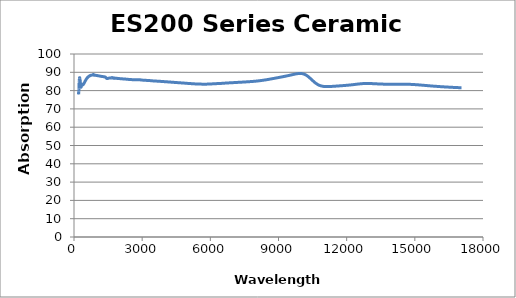
| Category | Absorption (%) |
|---|---|
| 200.0 | 78.962 |
| 202.0 | 78.067 |
| 204.0 | 78.136 |
| 206.0 | 78.055 |
| 208.0 | 78.484 |
| 210.0 | 78.688 |
| 212.0 | 79.382 |
| 214.0 | 79.749 |
| 216.0 | 80.206 |
| 218.0 | 80.399 |
| 220.0 | 80.989 |
| 222.0 | 82.009 |
| 224.0 | 83.18 |
| 226.0 | 84.331 |
| 228.0 | 84.98 |
| 230.0 | 85.338 |
| 232.0 | 85.501 |
| 234.0 | 85.71 |
| 236.0 | 85.977 |
| 238.0 | 86.397 |
| 240.0 | 86.532 |
| 242.0 | 86.776 |
| 244.0 | 86.933 |
| 246.0 | 87.055 |
| 248.0 | 87.084 |
| 250.0 | 87.006 |
| 252.0 | 87.03 |
| 254.0 | 86.836 |
| 256.0 | 86.605 |
| 258.0 | 86.37 |
| 260.0 | 86.319 |
| 262.0 | 86.257 |
| 264.0 | 86.175 |
| 266.0 | 86.02 |
| 268.0 | 85.838 |
| 270.0 | 85.639 |
| 272.0 | 85.391 |
| 274.0 | 85.179 |
| 276.0 | 84.985 |
| 278.0 | 84.712 |
| 280.0 | 84.433 |
| 282.0 | 84.157 |
| 284.0 | 83.98 |
| 286.0 | 83.795 |
| 288.0 | 83.529 |
| 290.0 | 83.291 |
| 292.0 | 83.122 |
| 294.0 | 82.952 |
| 296.0 | 82.696 |
| 298.0 | 82.404 |
| 300.0 | 82.246 |
| 302.0 | 82.261 |
| 304.0 | 82.301 |
| 306.0 | 82.162 |
| 308.0 | 82.017 |
| 310.0 | 81.891 |
| 312.0 | 81.941 |
| 314.0 | 82.005 |
| 316.0 | 82 |
| 318.0 | 82.013 |
| 320.0 | 82.145 |
| 322.0 | 82.35 |
| 324.0 | 82.428 |
| 326.0 | 82.441 |
| 328.0 | 82.479 |
| 330.0 | 82.548 |
| 332.0 | 82.533 |
| 334.0 | 82.593 |
| 336.0 | 82.729 |
| 338.0 | 82.901 |
| 340.0 | 82.912 |
| 342.0 | 82.95 |
| 344.0 | 82.934 |
| 346.0 | 82.972 |
| 348.0 | 83.001 |
| 350.0 | 83.107 |
| 352.0 | 83.22 |
| 354.0 | 83.194 |
| 356.0 | 83.218 |
| 358.0 | 83.263 |
| 360.0 | 83.355 |
| 362.0 | 83.367 |
| 364.0 | 83.328 |
| 366.0 | 83.35 |
| 368.0 | 83.405 |
| 370.0 | 83.447 |
| 372.0 | 83.47 |
| 374.0 | 83.496 |
| 376.0 | 83.487 |
| 378.0 | 83.438 |
| 380.0 | 83.412 |
| 382.0 | 83.383 |
| 384.0 | 83.387 |
| 386.0 | 83.359 |
| 388.0 | 83.309 |
| 390.0 | 83.312 |
| 392.0 | 83.226 |
| 394.0 | 83.225 |
| 396.0 | 83.188 |
| 398.0 | 83.212 |
| 400.0 | 83.206 |
| 402.0 | 83.19 |
| 404.0 | 83.229 |
| 406.0 | 83.252 |
| 408.0 | 83.34 |
| 410.0 | 83.359 |
| 412.0 | 83.381 |
| 414.0 | 83.415 |
| 416.0 | 83.446 |
| 418.0 | 83.504 |
| 420.0 | 83.546 |
| 422.0 | 83.656 |
| 424.0 | 83.728 |
| 426.0 | 83.764 |
| 428.0 | 83.748 |
| 430.0 | 83.764 |
| 432.0 | 83.781 |
| 434.0 | 83.854 |
| 436.0 | 83.896 |
| 438.0 | 83.926 |
| 440.0 | 83.906 |
| 442.0 | 83.967 |
| 444.0 | 84.074 |
| 446.0 | 84.131 |
| 448.0 | 84.176 |
| 450.0 | 84.178 |
| 452.0 | 84.235 |
| 454.0 | 84.261 |
| 456.0 | 84.32 |
| 458.0 | 84.36 |
| 460.0 | 84.408 |
| 462.0 | 84.45 |
| 464.0 | 84.504 |
| 466.0 | 84.58 |
| 468.0 | 84.596 |
| 470.0 | 84.64 |
| 472.0 | 84.686 |
| 474.0 | 84.757 |
| 476.0 | 84.822 |
| 478.0 | 84.858 |
| 480.0 | 84.932 |
| 482.0 | 84.976 |
| 484.0 | 85.029 |
| 486.0 | 85.054 |
| 488.0 | 85.092 |
| 490.0 | 85.109 |
| 492.0 | 85.158 |
| 494.0 | 85.22 |
| 496.0 | 85.297 |
| 498.0 | 85.359 |
| 500.0 | 85.376 |
| 502.0 | 85.412 |
| 504.0 | 85.441 |
| 506.0 | 85.489 |
| 508.0 | 85.521 |
| 510.0 | 85.572 |
| 512.0 | 85.617 |
| 514.0 | 85.668 |
| 516.0 | 85.724 |
| 518.0 | 85.767 |
| 520.0 | 85.83 |
| 522.0 | 85.85 |
| 524.0 | 85.897 |
| 526.0 | 85.925 |
| 528.0 | 85.981 |
| 530.0 | 86.039 |
| 532.0 | 86.095 |
| 534.0 | 86.14 |
| 536.0 | 86.15 |
| 538.0 | 86.147 |
| 540.0 | 86.167 |
| 542.0 | 86.256 |
| 544.0 | 86.298 |
| 546.0 | 86.345 |
| 548.0 | 86.337 |
| 550.0 | 86.396 |
| 552.0 | 86.42 |
| 554.0 | 86.462 |
| 556.0 | 86.504 |
| 558.0 | 86.547 |
| 560.0 | 86.61 |
| 562.0 | 86.61 |
| 564.0 | 86.641 |
| 566.0 | 86.659 |
| 568.0 | 86.714 |
| 570.0 | 86.759 |
| 572.0 | 86.798 |
| 574.0 | 86.846 |
| 576.0 | 86.866 |
| 578.0 | 86.883 |
| 580.0 | 86.895 |
| 582.0 | 86.93 |
| 584.0 | 86.974 |
| 586.0 | 87.006 |
| 588.0 | 87.023 |
| 590.0 | 87.04 |
| 592.0 | 87.058 |
| 594.0 | 87.086 |
| 596.0 | 87.151 |
| 598.0 | 87.178 |
| 600.0 | 87.198 |
| 602.0 | 87.166 |
| 604.0 | 87.205 |
| 606.0 | 87.237 |
| 608.0 | 87.301 |
| 610.0 | 87.296 |
| 612.0 | 87.345 |
| 614.0 | 87.347 |
| 616.0 | 87.404 |
| 618.0 | 87.436 |
| 620.0 | 87.482 |
| 622.0 | 87.512 |
| 624.0 | 87.523 |
| 626.0 | 87.557 |
| 628.0 | 87.577 |
| 630.0 | 87.583 |
| 632.0 | 87.598 |
| 634.0 | 87.596 |
| 636.0 | 87.622 |
| 638.0 | 87.606 |
| 640.0 | 87.652 |
| 642.0 | 87.64 |
| 644.0 | 87.65 |
| 646.0 | 87.653 |
| 648.0 | 87.728 |
| 650.0 | 87.783 |
| 652.0 | 87.818 |
| 654.0 | 87.823 |
| 656.0 | 87.816 |
| 658.0 | 87.865 |
| 660.0 | 87.863 |
| 662.0 | 87.889 |
| 664.0 | 87.859 |
| 666.0 | 87.867 |
| 668.0 | 87.882 |
| 670.0 | 87.915 |
| 672.0 | 87.941 |
| 674.0 | 87.949 |
| 676.0 | 87.907 |
| 678.0 | 87.926 |
| 680.0 | 87.959 |
| 682.0 | 88.031 |
| 684.0 | 88.02 |
| 686.0 | 88.029 |
| 688.0 | 88.033 |
| 690.0 | 88.064 |
| 692.0 | 88.108 |
| 694.0 | 88.1 |
| 696.0 | 88.122 |
| 698.0 | 88.074 |
| 700.0 | 88.121 |
| 702.0 | 88.144 |
| 704.0 | 88.194 |
| 706.0 | 88.143 |
| 708.0 | 88.132 |
| 710.0 | 88.147 |
| 712.0 | 88.207 |
| 714.0 | 88.234 |
| 716.0 | 88.271 |
| 718.0 | 88.3 |
| 720.0 | 88.308 |
| 722.0 | 88.295 |
| 724.0 | 88.295 |
| 726.0 | 88.299 |
| 728.0 | 88.311 |
| 730.0 | 88.314 |
| 732.0 | 88.337 |
| 734.0 | 88.33 |
| 736.0 | 88.336 |
| 738.0 | 88.338 |
| 740.0 | 88.342 |
| 742.0 | 88.352 |
| 744.0 | 88.373 |
| 746.0 | 88.379 |
| 748.0 | 88.387 |
| 750.0 | 88.393 |
| 752.0 | 88.384 |
| 754.0 | 88.382 |
| 756.0 | 88.379 |
| 758.0 | 88.382 |
| 760.0 | 88.389 |
| 762.0 | 88.394 |
| 764.0 | 88.407 |
| 766.0 | 88.421 |
| 768.0 | 88.426 |
| 770.0 | 88.434 |
| 772.0 | 88.441 |
| 774.0 | 88.434 |
| 776.0 | 88.435 |
| 778.0 | 88.442 |
| 780.0 | 88.434 |
| 782.0 | 88.444 |
| 784.0 | 88.45 |
| 786.0 | 88.452 |
| 788.0 | 88.456 |
| 790.0 | 88.473 |
| 792.0 | 88.469 |
| 794.0 | 88.468 |
| 796.0 | 88.469 |
| 798.0 | 88.472 |
| 800.0 | 88.471 |
| 802.0 | 88.48 |
| 804.0 | 88.489 |
| 806.0 | 88.493 |
| 808.0 | 88.483 |
| 810.0 | 88.489 |
| 812.0 | 88.487 |
| 814.0 | 88.489 |
| 816.0 | 88.492 |
| 818.0 | 88.492 |
| 820.0 | 88.476 |
| 822.0 | 88.469 |
| 824.0 | 88.466 |
| 826.0 | 88.462 |
| 828.0 | 88.478 |
| 830.0 | 88.51 |
| 832.0 | 88.604 |
| 834.0 | 88.626 |
| 836.0 | 88.65 |
| 838.0 | 88.69 |
| 840.0 | 88.759 |
| 842.0 | 88.73 |
| 844.0 | 88.735 |
| 846.0 | 88.744 |
| 848.0 | 88.726 |
| 850.0 | 88.652 |
| 852.0 | 88.625 |
| 854.0 | 88.725 |
| 856.0 | 88.703 |
| 858.0 | 88.714 |
| 860.0 | 88.761 |
| 862.0 | 88.743 |
| 864.0 | 88.608 |
| 866.0 | 88.61 |
| 868.0 | 88.572 |
| 870.0 | 88.518 |
| 872.0 | 88.465 |
| 874.0 | 88.479 |
| 876.0 | 88.504 |
| 878.0 | 88.528 |
| 880.0 | 88.555 |
| 882.0 | 88.618 |
| 884.0 | 88.633 |
| 886.0 | 88.579 |
| 888.0 | 88.519 |
| 890.0 | 88.461 |
| 892.0 | 88.472 |
| 894.0 | 88.457 |
| 896.0 | 88.464 |
| 898.0 | 88.503 |
| 900.0 | 88.528 |
| 902.0 | 88.493 |
| 904.0 | 88.482 |
| 906.0 | 88.493 |
| 908.0 | 88.455 |
| 910.0 | 88.432 |
| 912.0 | 88.406 |
| 914.0 | 88.405 |
| 916.0 | 88.374 |
| 918.0 | 88.376 |
| 920.0 | 88.377 |
| 922.0 | 88.383 |
| 924.0 | 88.377 |
| 926.0 | 88.382 |
| 928.0 | 88.39 |
| 930.0 | 88.403 |
| 932.0 | 88.404 |
| 934.0 | 88.395 |
| 936.0 | 88.398 |
| 938.0 | 88.398 |
| 940.0 | 88.378 |
| 942.0 | 88.376 |
| 944.0 | 88.374 |
| 946.0 | 88.368 |
| 948.0 | 88.36 |
| 950.0 | 88.366 |
| 952.0 | 88.358 |
| 954.0 | 88.353 |
| 956.0 | 88.357 |
| 958.0 | 88.352 |
| 960.0 | 88.346 |
| 962.0 | 88.338 |
| 964.0 | 88.333 |
| 966.0 | 88.33 |
| 968.0 | 88.326 |
| 970.0 | 88.308 |
| 972.0 | 88.305 |
| 974.0 | 88.292 |
| 976.0 | 88.274 |
| 978.0 | 88.265 |
| 980.0 | 88.267 |
| 982.0 | 88.263 |
| 984.0 | 88.26 |
| 986.0 | 88.259 |
| 988.0 | 88.262 |
| 990.0 | 88.256 |
| 992.0 | 88.253 |
| 994.0 | 88.256 |
| 996.0 | 88.253 |
| 998.0 | 88.248 |
| 1000.0 | 88.238 |
| 1002.0 | 88.236 |
| 1004.0 | 88.234 |
| 1006.0 | 88.233 |
| 1008.0 | 88.229 |
| 1010.0 | 88.229 |
| 1012.0 | 88.223 |
| 1014.0 | 88.219 |
| 1016.0 | 88.214 |
| 1018.0 | 88.21 |
| 1020.0 | 88.211 |
| 1022.0 | 88.214 |
| 1024.0 | 88.197 |
| 1026.0 | 88.194 |
| 1028.0 | 88.188 |
| 1030.0 | 88.181 |
| 1032.0 | 88.173 |
| 1034.0 | 88.176 |
| 1036.0 | 88.173 |
| 1038.0 | 88.173 |
| 1040.0 | 88.17 |
| 1042.0 | 88.166 |
| 1044.0 | 88.164 |
| 1046.0 | 88.162 |
| 1048.0 | 88.156 |
| 1050.0 | 88.15 |
| 1052.0 | 88.144 |
| 1054.0 | 88.135 |
| 1056.0 | 88.129 |
| 1058.0 | 88.127 |
| 1060.0 | 88.122 |
| 1062.0 | 88.118 |
| 1064.0 | 88.117 |
| 1066.0 | 88.111 |
| 1068.0 | 88.1 |
| 1070.0 | 88.093 |
| 1072.0 | 88.09 |
| 1074.0 | 88.081 |
| 1076.0 | 88.078 |
| 1078.0 | 88.078 |
| 1080.0 | 88.076 |
| 1082.0 | 88.074 |
| 1084.0 | 88.071 |
| 1086.0 | 88.066 |
| 1088.0 | 88.064 |
| 1090.0 | 88.059 |
| 1092.0 | 88.055 |
| 1094.0 | 88.05 |
| 1096.0 | 88.044 |
| 1098.0 | 88.037 |
| 1100.0 | 88.033 |
| 1102.0 | 88.026 |
| 1104.0 | 88.026 |
| 1106.0 | 88.023 |
| 1108.0 | 88.019 |
| 1110.0 | 88.013 |
| 1112.0 | 88.011 |
| 1114.0 | 88.003 |
| 1116.0 | 87.992 |
| 1118.0 | 87.99 |
| 1120.0 | 87.989 |
| 1122.0 | 87.984 |
| 1124.0 | 87.978 |
| 1126.0 | 87.976 |
| 1128.0 | 87.965 |
| 1130.0 | 87.954 |
| 1132.0 | 87.946 |
| 1134.0 | 87.94 |
| 1136.0 | 87.936 |
| 1138.0 | 87.932 |
| 1140.0 | 87.923 |
| 1142.0 | 87.919 |
| 1144.0 | 87.913 |
| 1146.0 | 87.904 |
| 1148.0 | 87.898 |
| 1150.0 | 87.897 |
| 1152.0 | 87.892 |
| 1154.0 | 87.888 |
| 1156.0 | 87.882 |
| 1158.0 | 87.878 |
| 1160.0 | 87.872 |
| 1162.0 | 87.865 |
| 1164.0 | 87.861 |
| 1166.0 | 87.856 |
| 1168.0 | 87.852 |
| 1170.0 | 87.848 |
| 1172.0 | 87.842 |
| 1174.0 | 87.834 |
| 1176.0 | 87.83 |
| 1178.0 | 87.826 |
| 1180.0 | 87.822 |
| 1182.0 | 87.817 |
| 1184.0 | 87.813 |
| 1186.0 | 87.807 |
| 1188.0 | 87.801 |
| 1190.0 | 87.798 |
| 1192.0 | 87.794 |
| 1194.0 | 87.785 |
| 1196.0 | 87.783 |
| 1198.0 | 87.779 |
| 1200.0 | 87.774 |
| 1202.0 | 87.771 |
| 1204.0 | 87.77 |
| 1206.0 | 87.767 |
| 1208.0 | 87.763 |
| 1210.0 | 87.757 |
| 1212.0 | 87.755 |
| 1214.0 | 87.753 |
| 1216.0 | 87.75 |
| 1218.0 | 87.746 |
| 1220.0 | 87.745 |
| 1222.0 | 87.74 |
| 1224.0 | 87.736 |
| 1226.0 | 87.732 |
| 1228.0 | 87.735 |
| 1230.0 | 87.728 |
| 1232.0 | 87.726 |
| 1234.0 | 87.721 |
| 1236.0 | 87.718 |
| 1238.0 | 87.71 |
| 1240.0 | 87.706 |
| 1242.0 | 87.706 |
| 1244.0 | 87.704 |
| 1246.0 | 87.701 |
| 1248.0 | 87.702 |
| 1250.0 | 87.7 |
| 1252.0 | 87.695 |
| 1254.0 | 87.69 |
| 1256.0 | 87.685 |
| 1258.0 | 87.678 |
| 1260.0 | 87.676 |
| 1262.0 | 87.669 |
| 1264.0 | 87.665 |
| 1266.0 | 87.661 |
| 1268.0 | 87.658 |
| 1270.0 | 87.652 |
| 1272.0 | 87.648 |
| 1274.0 | 87.648 |
| 1276.0 | 87.648 |
| 1278.0 | 87.645 |
| 1280.0 | 87.643 |
| 1282.0 | 87.64 |
| 1284.0 | 87.636 |
| 1286.0 | 87.631 |
| 1288.0 | 87.627 |
| 1290.0 | 87.624 |
| 1292.0 | 87.622 |
| 1294.0 | 87.619 |
| 1296.0 | 87.618 |
| 1298.0 | 87.612 |
| 1300.0 | 87.609 |
| 1302.0 | 87.606 |
| 1304.0 | 87.604 |
| 1306.0 | 87.595 |
| 1308.0 | 87.593 |
| 1310.0 | 87.588 |
| 1312.0 | 87.581 |
| 1314.0 | 87.573 |
| 1316.0 | 87.57 |
| 1318.0 | 87.56 |
| 1320.0 | 87.554 |
| 1322.0 | 87.547 |
| 1324.0 | 87.54 |
| 1326.0 | 87.532 |
| 1328.0 | 87.528 |
| 1330.0 | 87.52 |
| 1332.0 | 87.516 |
| 1334.0 | 87.509 |
| 1336.0 | 87.506 |
| 1338.0 | 87.505 |
| 1340.0 | 87.504 |
| 1342.0 | 87.501 |
| 1344.0 | 87.497 |
| 1346.0 | 87.492 |
| 1348.0 | 87.488 |
| 1350.0 | 87.481 |
| 1352.0 | 87.472 |
| 1354.0 | 87.467 |
| 1356.0 | 87.461 |
| 1358.0 | 87.45 |
| 1360.0 | 87.442 |
| 1362.0 | 87.44 |
| 1364.0 | 87.433 |
| 1366.0 | 87.429 |
| 1368.0 | 87.423 |
| 1370.0 | 87.413 |
| 1372.0 | 87.404 |
| 1374.0 | 87.392 |
| 1376.0 | 87.378 |
| 1378.0 | 87.36 |
| 1380.0 | 87.346 |
| 1382.0 | 87.327 |
| 1384.0 | 87.309 |
| 1386.0 | 87.287 |
| 1388.0 | 87.27 |
| 1390.0 | 87.249 |
| 1392.0 | 87.226 |
| 1394.0 | 87.196 |
| 1396.0 | 87.163 |
| 1398.0 | 87.132 |
| 1400.0 | 87.102 |
| 1402.0 | 87.069 |
| 1404.0 | 87.039 |
| 1406.0 | 87.01 |
| 1408.0 | 86.978 |
| 1410.0 | 86.944 |
| 1412.0 | 86.918 |
| 1414.0 | 86.893 |
| 1416.0 | 86.87 |
| 1418.0 | 86.844 |
| 1420.0 | 86.821 |
| 1422.0 | 86.798 |
| 1424.0 | 86.775 |
| 1426.0 | 86.757 |
| 1428.0 | 86.74 |
| 1430.0 | 86.72 |
| 1432.0 | 86.704 |
| 1434.0 | 86.692 |
| 1436.0 | 86.676 |
| 1438.0 | 86.664 |
| 1440.0 | 86.658 |
| 1442.0 | 86.649 |
| 1444.0 | 86.635 |
| 1446.0 | 86.631 |
| 1448.0 | 86.625 |
| 1450.0 | 86.621 |
| 1452.0 | 86.615 |
| 1454.0 | 86.613 |
| 1456.0 | 86.61 |
| 1458.0 | 86.609 |
| 1460.0 | 86.608 |
| 1462.0 | 86.605 |
| 1464.0 | 86.606 |
| 1466.0 | 86.603 |
| 1468.0 | 86.603 |
| 1470.0 | 86.602 |
| 1472.0 | 86.605 |
| 1474.0 | 86.607 |
| 1476.0 | 86.616 |
| 1478.0 | 86.623 |
| 1480.0 | 86.629 |
| 1482.0 | 86.632 |
| 1484.0 | 86.639 |
| 1486.0 | 86.645 |
| 1488.0 | 86.653 |
| 1490.0 | 86.662 |
| 1492.0 | 86.676 |
| 1494.0 | 86.686 |
| 1496.0 | 86.693 |
| 1498.0 | 86.698 |
| 1500.0 | 86.708 |
| 1502.0 | 86.713 |
| 1504.0 | 86.721 |
| 1506.0 | 86.731 |
| 1508.0 | 86.743 |
| 1510.0 | 86.746 |
| 1512.0 | 86.759 |
| 1514.0 | 86.765 |
| 1516.0 | 86.773 |
| 1518.0 | 86.781 |
| 1520.0 | 86.79 |
| 1522.0 | 86.793 |
| 1524.0 | 86.8 |
| 1526.0 | 86.799 |
| 1528.0 | 86.803 |
| 1530.0 | 86.806 |
| 1532.0 | 86.814 |
| 1534.0 | 86.821 |
| 1536.0 | 86.829 |
| 1538.0 | 86.833 |
| 1540.0 | 86.84 |
| 1542.0 | 86.837 |
| 1544.0 | 86.84 |
| 1546.0 | 86.843 |
| 1548.0 | 86.851 |
| 1550.0 | 86.852 |
| 1552.0 | 86.859 |
| 1554.0 | 86.852 |
| 1556.0 | 86.853 |
| 1558.0 | 86.846 |
| 1560.0 | 86.846 |
| 1562.0 | 86.846 |
| 1564.0 | 86.854 |
| 1566.0 | 86.857 |
| 1568.0 | 86.863 |
| 1570.0 | 86.858 |
| 1572.0 | 86.858 |
| 1574.0 | 86.855 |
| 1576.0 | 86.856 |
| 1578.0 | 86.85 |
| 1580.0 | 86.856 |
| 1582.0 | 86.856 |
| 1584.0 | 86.856 |
| 1586.0 | 86.858 |
| 1588.0 | 86.864 |
| 1590.0 | 86.864 |
| 1592.0 | 86.86 |
| 1594.0 | 86.867 |
| 1596.0 | 86.862 |
| 1598.0 | 86.86 |
| 1600.0 | 86.861 |
| 1602.0 | 86.864 |
| 1604.0 | 86.864 |
| 1606.0 | 86.869 |
| 1608.0 | 86.87 |
| 1610.0 | 86.869 |
| 1612.0 | 86.874 |
| 1614.0 | 86.872 |
| 1616.0 | 86.87 |
| 1618.0 | 86.871 |
| 1620.0 | 86.874 |
| 1622.0 | 86.87 |
| 1624.0 | 86.878 |
| 1626.0 | 86.874 |
| 1628.0 | 86.874 |
| 1630.0 | 86.873 |
| 1632.0 | 86.873 |
| 1634.0 | 86.868 |
| 1636.0 | 86.872 |
| 1638.0 | 86.874 |
| 1640.0 | 86.868 |
| 1642.0 | 86.872 |
| 1644.0 | 86.877 |
| 1646.0 | 86.882 |
| 1648.0 | 86.927 |
| 1650.0 | 87.003 |
| 1652.0 | 87.035 |
| 1654.0 | 87.058 |
| 1656.0 | 87.095 |
| 1658.0 | 87.096 |
| 1660.0 | 87.071 |
| 1662.0 | 87.067 |
| 1664.0 | 87.094 |
| 1666.0 | 87.081 |
| 1668.0 | 87.084 |
| 1670.0 | 87.041 |
| 1672.0 | 87.072 |
| 1674.0 | 87.067 |
| 1676.0 | 87.046 |
| 1678.0 | 87.064 |
| 1680.0 | 87.094 |
| 1682.0 | 87.036 |
| 1684.0 | 86.99 |
| 1686.0 | 87.023 |
| 1688.0 | 86.925 |
| 1690.0 | 86.945 |
| 1692.0 | 86.917 |
| 1694.0 | 86.946 |
| 1696.0 | 86.933 |
| 1698.0 | 86.939 |
| 1700.0 | 86.928 |
| 1702.0 | 86.969 |
| 1704.0 | 86.928 |
| 1706.0 | 86.894 |
| 1708.0 | 86.946 |
| 1710.0 | 86.931 |
| 1712.0 | 86.854 |
| 1714.0 | 86.84 |
| 1716.0 | 86.89 |
| 1718.0 | 86.897 |
| 1720.0 | 86.867 |
| 1722.0 | 86.963 |
| 1724.0 | 86.948 |
| 1726.0 | 86.883 |
| 1728.0 | 86.919 |
| 1730.0 | 86.903 |
| 1732.0 | 86.928 |
| 1734.0 | 86.856 |
| 1736.0 | 86.916 |
| 1738.0 | 86.84 |
| 1740.0 | 86.834 |
| 1742.0 | 86.759 |
| 1744.0 | 86.89 |
| 1746.0 | 86.863 |
| 1748.0 | 86.81 |
| 1750.0 | 86.858 |
| 1752.0 | 86.862 |
| 1754.0 | 86.819 |
| 1756.0 | 86.802 |
| 1758.0 | 86.838 |
| 1760.0 | 86.797 |
| 1762.0 | 86.747 |
| 1764.0 | 86.723 |
| 1766.0 | 86.707 |
| 1768.0 | 86.712 |
| 1770.0 | 86.682 |
| 1772.0 | 86.776 |
| 1774.0 | 86.784 |
| 1776.0 | 86.758 |
| 1778.0 | 86.769 |
| 1780.0 | 86.804 |
| 1782.0 | 86.715 |
| 1784.0 | 86.73 |
| 1786.0 | 86.809 |
| 1788.0 | 86.857 |
| 1790.0 | 86.824 |
| 1792.0 | 86.799 |
| 1794.0 | 86.843 |
| 1796.0 | 86.821 |
| 1798.0 | 86.687 |
| 1800.0 | 86.739 |
| 1805.0 | 86.726 |
| 1810.0 | 86.731 |
| 1815.0 | 86.742 |
| 1821.0 | 86.751 |
| 1826.0 | 86.755 |
| 1831.0 | 86.758 |
| 1836.0 | 86.752 |
| 1841.0 | 86.75 |
| 1846.0 | 86.767 |
| 1852.0 | 86.769 |
| 1857.0 | 86.737 |
| 1862.0 | 86.705 |
| 1868.0 | 86.69 |
| 1873.0 | 86.694 |
| 1879.0 | 86.721 |
| 1884.0 | 86.741 |
| 1889.0 | 86.725 |
| 1895.0 | 86.691 |
| 1901.0 | 86.658 |
| 1906.0 | 86.641 |
| 1912.0 | 86.644 |
| 1917.0 | 86.649 |
| 1923.0 | 86.631 |
| 1929.0 | 86.608 |
| 1935.0 | 86.607 |
| 1940.0 | 86.62 |
| 1946.0 | 86.633 |
| 1952.0 | 86.642 |
| 1958.0 | 86.647 |
| 1964.0 | 86.646 |
| 1970.0 | 86.637 |
| 1976.0 | 86.619 |
| 1982.0 | 86.592 |
| 1988.0 | 86.574 |
| 1994.0 | 86.566 |
| 2000.0 | 86.559 |
| 2006.0 | 86.553 |
| 2013.0 | 86.544 |
| 2019.0 | 86.538 |
| 2025.0 | 86.541 |
| 2032.0 | 86.543 |
| 2038.0 | 86.533 |
| 2044.0 | 86.516 |
| 2051.0 | 86.516 |
| 2057.0 | 86.53 |
| 2064.0 | 86.538 |
| 2071.0 | 86.527 |
| 2077.0 | 86.512 |
| 2084.0 | 86.488 |
| 2091.0 | 86.458 |
| 2097.0 | 86.443 |
| 2104.0 | 86.453 |
| 2111.0 | 86.465 |
| 2118.0 | 86.462 |
| 2125.0 | 86.447 |
| 2132.0 | 86.421 |
| 2139.0 | 86.396 |
| 2146.0 | 86.39 |
| 2153.0 | 86.391 |
| 2160.0 | 86.381 |
| 2168.0 | 86.364 |
| 2175.0 | 86.353 |
| 2182.0 | 86.348 |
| 2190.0 | 86.347 |
| 2197.0 | 86.35 |
| 2204.0 | 86.352 |
| 2212.0 | 86.349 |
| 2220.0 | 86.338 |
| 2227.0 | 86.323 |
| 2235.0 | 86.321 |
| 2243.0 | 86.329 |
| 2250.0 | 86.326 |
| 2258.0 | 86.309 |
| 2266.0 | 86.296 |
| 2274.0 | 86.291 |
| 2282.0 | 86.275 |
| 2290.0 | 86.251 |
| 2298.0 | 86.24 |
| 2306.0 | 86.237 |
| 2315.0 | 86.225 |
| 2323.0 | 86.213 |
| 2331.0 | 86.2 |
| 2340.0 | 86.188 |
| 2348.0 | 86.182 |
| 2357.0 | 86.177 |
| 2365.0 | 86.169 |
| 2374.0 | 86.165 |
| 2383.0 | 86.161 |
| 2392.0 | 86.144 |
| 2400.0 | 86.125 |
| 2409.0 | 86.116 |
| 2418.0 | 86.114 |
| 2427.0 | 86.105 |
| 2436.0 | 86.095 |
| 2446.0 | 86.089 |
| 2455.0 | 86.081 |
| 2464.0 | 86.071 |
| 2474.0 | 86.059 |
| 2483.0 | 86.047 |
| 2493.0 | 86.041 |
| 2502.0 | 86.038 |
| 2512.0 | 86.026 |
| 2522.0 | 86.012 |
| 2532.0 | 86.002 |
| 2542.0 | 85.996 |
| 2552.0 | 85.989 |
| 2562.0 | 85.98 |
| 2572.0 | 85.973 |
| 2582.0 | 85.968 |
| 2592.0 | 85.958 |
| 2603.0 | 85.942 |
| 2613.0 | 85.931 |
| 2624.0 | 85.925 |
| 2635.0 | 85.92 |
| 2645.0 | 85.915 |
| 2656.0 | 85.912 |
| 2667.0 | 85.906 |
| 2678.0 | 85.902 |
| 2689.0 | 85.901 |
| 2700.0 | 85.906 |
| 2712.0 | 85.915 |
| 2723.0 | 85.927 |
| 2735.0 | 85.936 |
| 2746.0 | 85.94 |
| 2758.0 | 85.945 |
| 2770.0 | 85.959 |
| 2782.0 | 85.969 |
| 2794.0 | 85.974 |
| 2806.0 | 85.976 |
| 2818.0 | 85.974 |
| 2830.0 | 85.966 |
| 2843.0 | 85.957 |
| 2855.0 | 85.948 |
| 2868.0 | 85.941 |
| 2880.0 | 85.936 |
| 2893.0 | 85.926 |
| 2906.0 | 85.91 |
| 2919.0 | 85.881 |
| 2933.0 | 85.843 |
| 2946.0 | 85.817 |
| 2959.0 | 85.806 |
| 2973.0 | 85.792 |
| 2987.0 | 85.771 |
| 3000.0 | 85.747 |
| 3014.0 | 85.724 |
| 3028.0 | 85.71 |
| 3043.0 | 85.707 |
| 3057.0 | 85.704 |
| 3072.0 | 85.698 |
| 3086.0 | 85.688 |
| 3101.0 | 85.673 |
| 3116.0 | 85.66 |
| 3131.0 | 85.65 |
| 3146.0 | 85.636 |
| 3161.0 | 85.613 |
| 3177.0 | 85.592 |
| 3193.0 | 85.58 |
| 3208.0 | 85.568 |
| 3224.0 | 85.559 |
| 3240.0 | 85.55 |
| 3257.0 | 85.535 |
| 3273.0 | 85.511 |
| 3290.0 | 85.489 |
| 3307.0 | 85.48 |
| 3324.0 | 85.475 |
| 3341.0 | 85.464 |
| 3358.0 | 85.447 |
| 3376.0 | 85.424 |
| 3393.0 | 85.393 |
| 3411.0 | 85.357 |
| 3429.0 | 85.328 |
| 3447.0 | 85.318 |
| 3466.0 | 85.314 |
| 3484.0 | 85.299 |
| 3503.0 | 85.277 |
| 3522.0 | 85.265 |
| 3542.0 | 85.263 |
| 3561.0 | 85.259 |
| 3581.0 | 85.244 |
| 3601.0 | 85.226 |
| 3621.0 | 85.204 |
| 3641.0 | 85.179 |
| 3662.0 | 85.156 |
| 3682.0 | 85.143 |
| 3703.0 | 85.135 |
| 3725.0 | 85.118 |
| 3746.0 | 85.096 |
| 3768.0 | 85.075 |
| 3790.0 | 85.058 |
| 3812.0 | 85.041 |
| 3835.0 | 85.023 |
| 3858.0 | 85.004 |
| 3881.0 | 84.987 |
| 3904.0 | 84.964 |
| 3928.0 | 84.938 |
| 3952.0 | 84.914 |
| 3976.0 | 84.895 |
| 4001.0 | 84.874 |
| 4025.0 | 84.853 |
| 4051.0 | 84.834 |
| 4076.0 | 84.813 |
| 4102.0 | 84.787 |
| 4128.0 | 84.759 |
| 4154.0 | 84.734 |
| 4181.0 | 84.711 |
| 4208.0 | 84.684 |
| 4236.0 | 84.656 |
| 4264.0 | 84.629 |
| 4292.0 | 84.603 |
| 4321.0 | 84.576 |
| 4350.0 | 84.551 |
| 4379.0 | 84.523 |
| 4409.0 | 84.49 |
| 4439.0 | 84.458 |
| 4470.0 | 84.429 |
| 4501.0 | 84.403 |
| 4532.0 | 84.378 |
| 4564.0 | 84.348 |
| 4596.0 | 84.317 |
| 4629.0 | 84.286 |
| 4663.0 | 84.259 |
| 4696.0 | 84.231 |
| 4731.0 | 84.2 |
| 4765.0 | 84.168 |
| 4801.0 | 84.136 |
| 4837.0 | 84.104 |
| 4873.0 | 84.072 |
| 4910.0 | 84.036 |
| 4947.0 | 83.995 |
| 4985.0 | 83.955 |
| 5024.0 | 83.919 |
| 5063.0 | 83.885 |
| 5103.0 | 83.851 |
| 5144.0 | 83.819 |
| 5185.0 | 83.784 |
| 5227.0 | 83.741 |
| 5269.0 | 83.702 |
| 5312.0 | 83.672 |
| 5356.0 | 83.648 |
| 5401.0 | 83.622 |
| 5446.0 | 83.595 |
| 5492.0 | 83.57 |
| 5539.0 | 83.554 |
| 5587.0 | 83.542 |
| 5636.0 | 83.531 |
| 5685.0 | 83.519 |
| 5735.0 | 83.512 |
| 5787.0 | 83.517 |
| 5839.0 | 83.532 |
| 5892.0 | 83.556 |
| 5946.0 | 83.587 |
| 6001.0 | 83.623 |
| 6057.0 | 83.656 |
| 6114.0 | 83.689 |
| 6172.0 | 83.728 |
| 6232.0 | 83.773 |
| 6292.0 | 83.824 |
| 6354.0 | 83.868 |
| 6417.0 | 83.9 |
| 6481.0 | 83.934 |
| 6546.0 | 83.986 |
| 6613.0 | 84.052 |
| 6681.0 | 84.115 |
| 6751.0 | 84.172 |
| 6822.0 | 84.222 |
| 6895.0 | 84.27 |
| 6969.0 | 84.32 |
| 7045.0 | 84.374 |
| 7122.0 | 84.433 |
| 7201.0 | 84.491 |
| 7282.0 | 84.546 |
| 7365.0 | 84.602 |
| 7449.0 | 84.664 |
| 7536.0 | 84.733 |
| 7625.0 | 84.802 |
| 7715.0 | 84.874 |
| 7808.0 | 84.956 |
| 7904.0 | 85.051 |
| 8001.0 | 85.161 |
| 8101.0 | 85.289 |
| 8204.0 | 85.447 |
| 8309.0 | 85.629 |
| 8417.0 | 85.831 |
| 8528.0 | 86.059 |
| 8641.0 | 86.31 |
| 8758.0 | 86.576 |
| 8878.0 | 86.85 |
| 9001.0 | 87.135 |
| 9128.0 | 87.435 |
| 9259.0 | 87.757 |
| 9393.0 | 88.1 |
| 9531.0 | 88.476 |
| 9673.0 | 88.88 |
| 9820.0 | 89.236 |
| 9971.0 | 89.366 |
| 10127.0 | 88.996 |
| 10287.0 | 87.868 |
| 10453.0 | 86.054 |
| 10625.0 | 84.155 |
| 10802.0 | 82.847 |
| 10985.0 | 82.288 |
| 11174.0 | 82.201 |
| 11370.0 | 82.31 |
| 11573.0 | 82.486 |
| 11784.0 | 82.678 |
| 12002.0 | 82.889 |
| 12228.0 | 83.17 |
| 12463.0 | 83.524 |
| 12708.0 | 83.819 |
| 12962.0 | 83.892 |
| 13226.0 | 83.752 |
| 13502.0 | 83.574 |
| 13789.0 | 83.496 |
| 14089.0 | 83.511 |
| 14402.0 | 83.531 |
| 14730.0 | 83.453 |
| 15072.0 | 83.216 |
| 15431.0 | 82.847 |
| 15807.0 | 82.448 |
| 16202.0 | 82.098 |
| 16618.0 | 81.798 |
| 17055.0 | 81.542 |